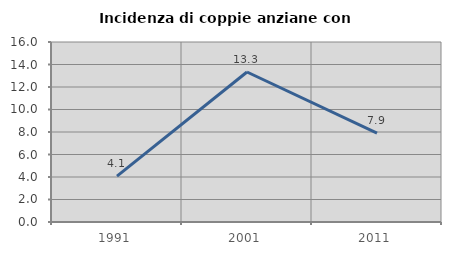
| Category | Incidenza di coppie anziane con figli |
|---|---|
| 1991.0 | 4.082 |
| 2001.0 | 13.333 |
| 2011.0 | 7.895 |